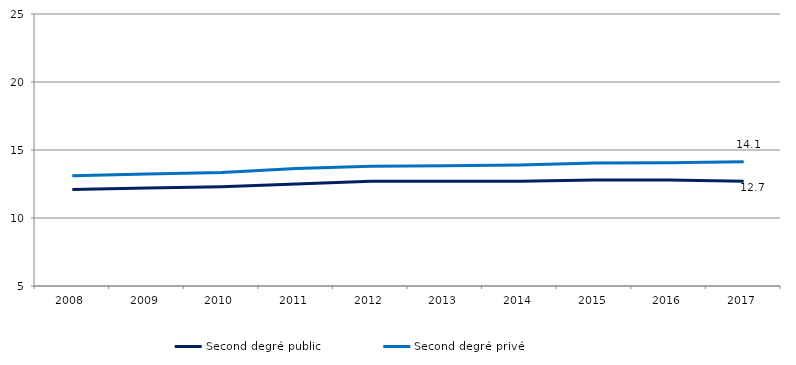
| Category | Second degré public | Second degré privé |
|---|---|---|
| 2008.0 | 12.1 | 13.105 |
| 2009.0 | 12.2 | 13.227 |
| 2010.0 | 12.3 | 13.352 |
| 2011.0 | 12.5 | 13.635 |
| 2012.0 | 12.7 | 13.813 |
| 2013.0 | 12.7 | 13.841 |
| 2014.0 | 12.7 | 13.893 |
| 2015.0 | 12.8 | 14.035 |
| 2016.0 | 12.8 | 14.068 |
| 2017.0 | 12.7 | 14.14 |